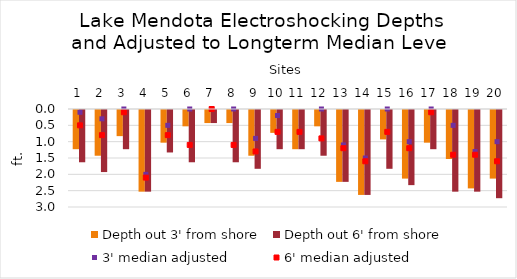
| Category | Depth out 3' from shore | Depth out 6' from shore |
|---|---|---|
| 1.0 | 1.2 | 1.6 |
| 2.0 | 1.4 | 1.9 |
| 3.0 | 0.8 | 1.2 |
| 4.0 | 2.5 | 2.5 |
| 5.0 | 1 | 1.3 |
| 6.0 | 0.5 | 1.6 |
| 7.0 | 0.4 | 0.4 |
| 8.0 | 0.4 | 1.6 |
| 9.0 | 1.4 | 1.8 |
| 10.0 | 0.7 | 1.2 |
| 11.0 | 1.2 | 1.2 |
| 12.0 | 0.5 | 1.4 |
| 13.0 | 2.2 | 2.2 |
| 14.0 | 2.6 | 2.6 |
| 15.0 | 0.9 | 1.8 |
| 16.0 | 2.1 | 2.3 |
| 17.0 | 1 | 1.2 |
| 18.0 | 1.5 | 2.5 |
| 19.0 | 2.4 | 2.5 |
| 20.0 | 2.1 | 2.7 |